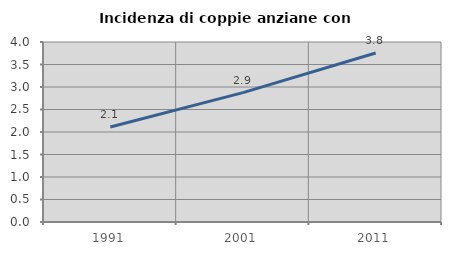
| Category | Incidenza di coppie anziane con figli |
|---|---|
| 1991.0 | 2.112 |
| 2001.0 | 2.875 |
| 2011.0 | 3.754 |